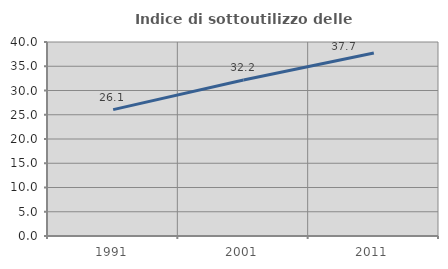
| Category | Indice di sottoutilizzo delle abitazioni  |
|---|---|
| 1991.0 | 26.061 |
| 2001.0 | 32.171 |
| 2011.0 | 37.723 |